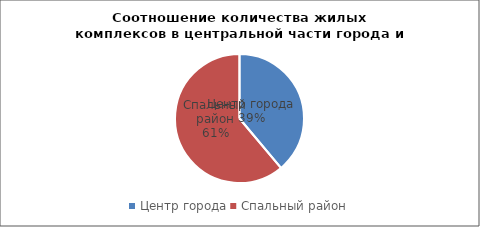
| Category | Series 0 |
|---|---|
| Центр города | 14 |
| Спальный район | 22 |